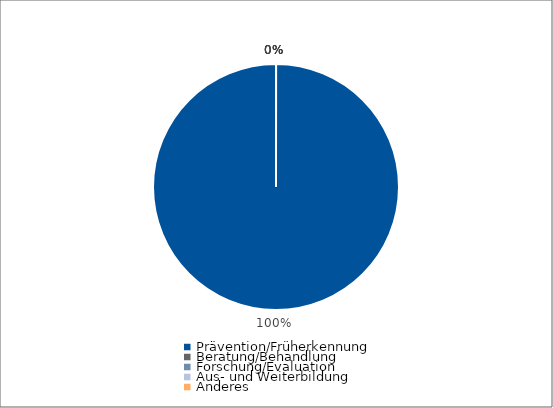
| Category | Series 0 |
|---|---|
| Prävention/Früherkennung | 11363.75 |
| Beratung/Behandlung | 0 |
| Forschung/Evaluation | 0 |
| Aus- und Weiterbildung | 0 |
| Anderes | 0 |